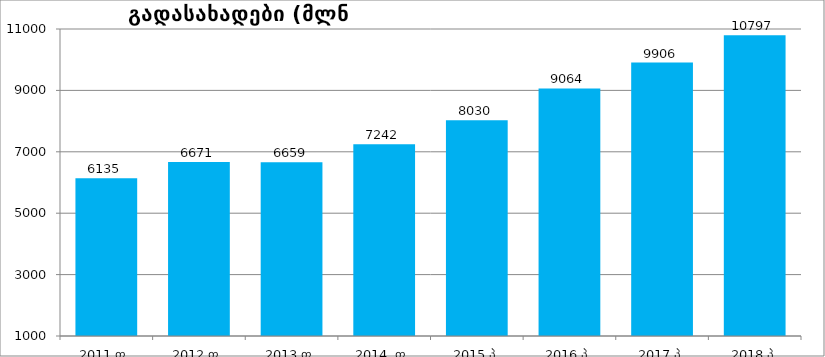
| Category | გადასახადები (მლნ ლარებში) |
|---|---|
| 2011 ფ | 6134.752 |
| 2012 ფ | 6670.969 |
| 2013 ფ | 6659.295 |
| 2014  ფ | 7242 |
| 2015 პ | 8030 |
| 2016 პ | 9064 |
| 2017 პ | 9906 |
| 2018 პ | 10797 |